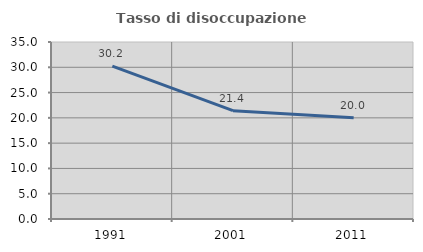
| Category | Tasso di disoccupazione giovanile  |
|---|---|
| 1991.0 | 30.233 |
| 2001.0 | 21.429 |
| 2011.0 | 20 |